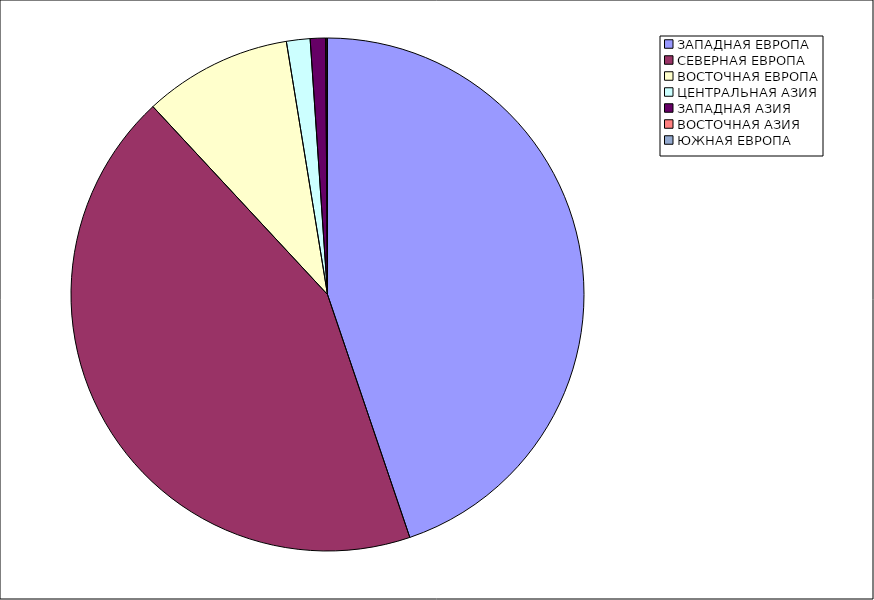
| Category | Оборот |
|---|---|
| ЗАПАДНАЯ ЕВРОПА | 44.799 |
| СЕВЕРНАЯ ЕВРОПА | 43.286 |
| ВОСТОЧНАЯ ЕВРОПА | 9.348 |
| ЦЕНТРАЛЬНАЯ АЗИЯ | 1.486 |
| ЗАПАДНАЯ АЗИЯ | 0.962 |
| ВОСТОЧНАЯ АЗИЯ | 0.078 |
| ЮЖНАЯ ЕВРОПА | 0.041 |